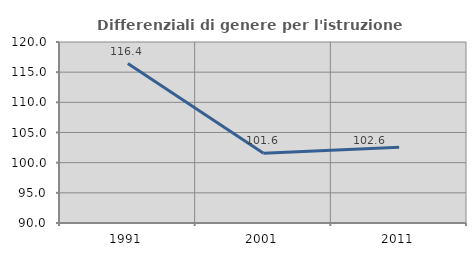
| Category | Differenziali di genere per l'istruzione superiore |
|---|---|
| 1991.0 | 116.43 |
| 2001.0 | 101.562 |
| 2011.0 | 102.563 |